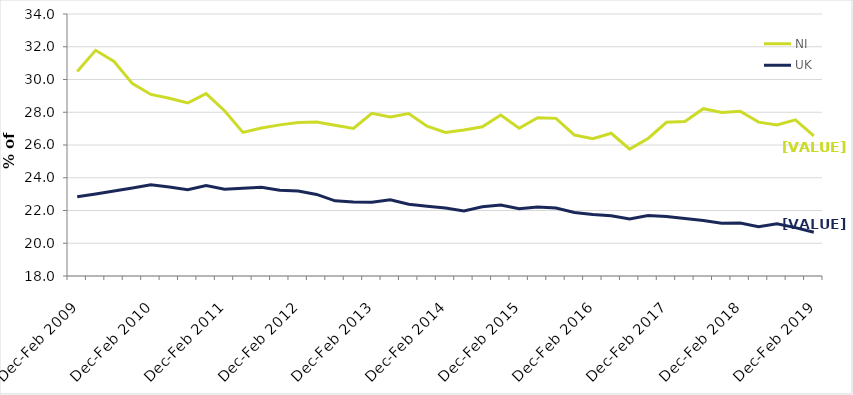
| Category | NI | UK |
|---|---|---|
| Dec-Feb 2009 | 30.485 | 22.838 |
| Mar-May 2009 | 31.781 | 23.012 |
| Jun-Aug 2009 | 31.102 | 23.19 |
| Sep-Nov 2009 | 29.75 | 23.371 |
| Dec-Feb 2010 | 29.087 | 23.57 |
| Mar-May 2010 | 28.851 | 23.429 |
| Jun-Aug 2010 | 28.566 | 23.27 |
| Sep-Nov 2010 | 29.138 | 23.518 |
| Dec-Feb 2011 | 28.094 | 23.297 |
| Mar-May 2011 | 26.772 | 23.362 |
| Jun-Aug 2011 | 27.037 | 23.423 |
| Sep-Nov 2011 | 27.228 | 23.236 |
| Dec-Feb 2012 | 27.371 | 23.194 |
| Mar-May 2012 | 27.398 | 22.98 |
| Jun-Aug 2012 | 27.21 | 22.589 |
| Sep-Nov 2012 | 27.009 | 22.519 |
| Dec-Feb 2013 | 27.931 | 22.499 |
| Mar-May 2013 | 27.714 | 22.65 |
| Jun-Aug 2013 | 27.917 | 22.378 |
| Sep-Nov 2013 | 27.144 | 22.258 |
| Dec-Feb 2014 | 26.764 | 22.147 |
| Mar-May 2014 | 26.916 | 21.969 |
| Jun-Aug 2014 | 27.117 | 22.224 |
| Sep-Nov 2014 | 27.83 | 22.331 |
| Dec-Feb 2015 | 27.019 | 22.102 |
| Mar-May 2015 | 27.663 | 22.208 |
| Jun-Aug 2015 | 27.627 | 22.147 |
| Sep-Nov 2015 | 26.607 | 21.876 |
| Dec-Feb 2016 | 26.39 | 21.762 |
| Mar-May 2016 | 26.717 | 21.68 |
| Jun-Aug 2016 | 25.75 | 21.489 |
| Sep-Nov 2016 | 26.398 | 21.696 |
| Dec-Feb 2017 | 27.386 | 21.639 |
| Mar-May 2017 | 27.429 | 21.505 |
| Jun-Aug 2017 | 28.219 | 21.393 |
| Sep-Nov 2017 | 27.989 | 21.226 |
| Dec-Feb 2018 | 28.064 | 21.23 |
| Mar-May 2018 | 27.395 | 21.007 |
| Jun-Aug 2018 | 27.227 | 21.183 |
| Sep-Nov 2018 | 27.537 | 20.956 |
| Dec-Feb 2019 | 26.552 | 20.67 |